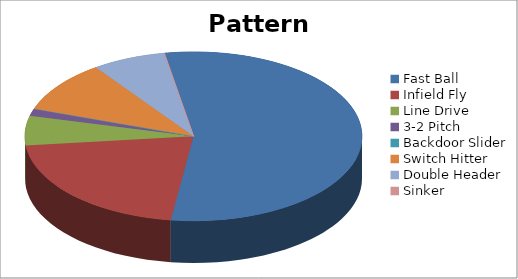
| Category | Pattern Distribution |
|---|---|
| Fast Ball | 39 |
| Infield Fly | 15 |
| Line Drive | 4 |
| 3-2 Pitch | 1 |
| Backdoor Slider | 0 |
| Switch Hitter | 7 |
| Double Header | 5 |
| Sinker | 0 |